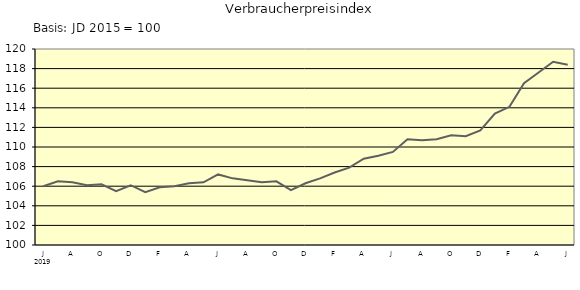
| Category | Series 0 |
|---|---|
| 0 | 106 |
| 1 | 106.5 |
| 2 | 106.4 |
| 3 | 106.1 |
| 4 | 106.2 |
| 5 | 105.5 |
| 6 | 106.1 |
| 7 | 105.4 |
| 8 | 105.9 |
| 9 | 106 |
| 10 | 106.3 |
| 11 | 106.4 |
| 12 | 107.2 |
| 13 | 106.8 |
| 14 | 106.6 |
| 15 | 106.4 |
| 16 | 106.5 |
| 17 | 105.6 |
| 18 | 106.3 |
| 19 | 106.8 |
| 20 | 107.4 |
| 21 | 107.9 |
| 22 | 108.8 |
| 23 | 109.1 |
| 24 | 109.5 |
| 25 | 110.8 |
| 26 | 110.7 |
| 27 | 110.8 |
| 28 | 111.2 |
| 29 | 111.1 |
| 30 | 111.7 |
| 31 | 113.4 |
| 32 | 114.1 |
| 33 | 116.5 |
| 34 | 117.6 |
| 35 | 118.7 |
| 36 | 118.4 |